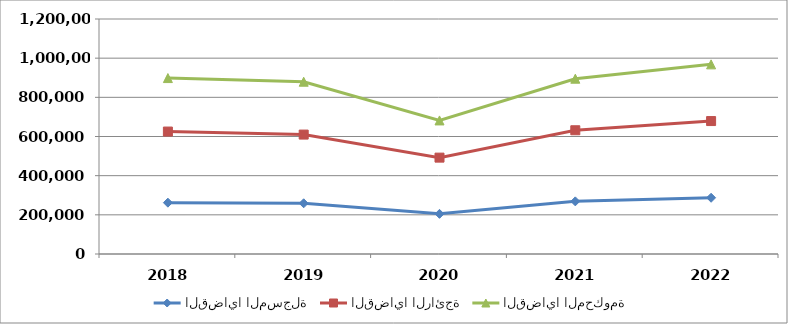
| Category | القضايا المسجلة | القضايا الرائجة | القضايا المحكومة |
|---|---|---|---|
| 2018.0 | 262140 | 363073 | 273114 |
| 2019.0 | 258943 | 350866 | 269868 |
| 2020.0 | 205022 | 287091 | 189927 |
| 2021.0 | 268757 | 363105 | 263208 |
| 2022.0 | 287234 | 391618 | 289514 |